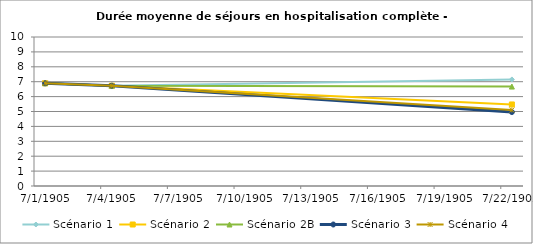
| Category | Scénario 1 | Scénario 2 | Scénario 2B | Scénario 3 | Scénario 4 |
|---|---|---|---|---|---|
| 2009.0 | 6.895 | 6.895 | 6.895 | 6.895 | 6.895 |
| 2012.0 | 6.731 | 6.731 | 6.731 | 6.731 | 6.731 |
| 2030.0 | 7.153 | 5.473 | 6.673 | 4.963 | 5.099 |